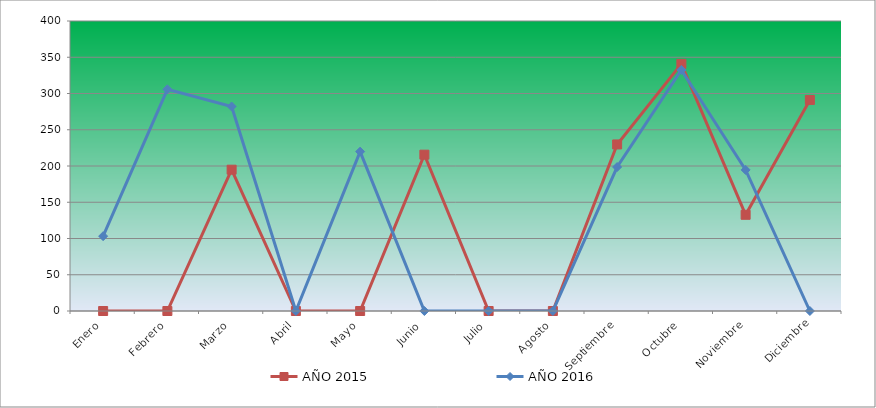
| Category | AÑO 2015 | AÑO 2016 |
|---|---|---|
| Enero | 0 | 103.226 |
| Febrero | 0 | 305.737 |
| Marzo | 194.897 | 282.097 |
| Abril | 0 | 0 |
| Mayo | 0 | 219.847 |
| Junio | 215.631 | 0 |
| Julio | 0 | 0 |
| Agosto | 0 | 0 |
| Septiembre | 229.73 | 198.571 |
| Octubre | 340.863 | 332.528 |
| Noviembre | 132.696 | 194.631 |
| Diciembre | 291.102 | 0 |